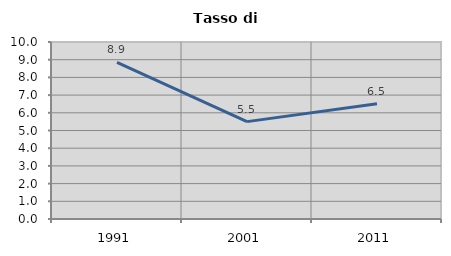
| Category | Tasso di disoccupazione   |
|---|---|
| 1991.0 | 8.853 |
| 2001.0 | 5.502 |
| 2011.0 | 6.505 |